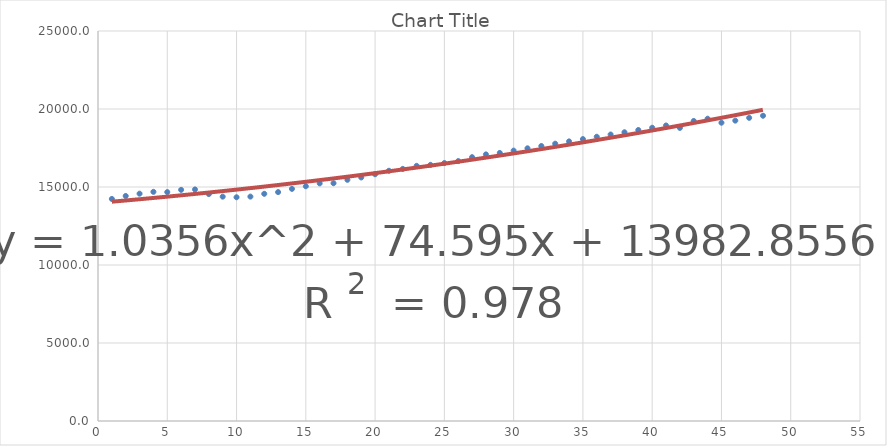
| Category | Series 0 |
|---|---|
| 1.0 | 14235 |
| 2.0 | 14424.5 |
| 3.0 | 14571.9 |
| 4.0 | 14690 |
| 5.0 | 14672.9 |
| 6.0 | 14817.1 |
| 7.0 | 14844.3 |
| 8.0 | 14546.7 |
| 9.0 | 14381.2 |
| 10.0 | 14342.1 |
| 11.0 | 14384.4 |
| 12.0 | 14564.1 |
| 13.0 | 14672.5 |
| 14.0 | 14879.2 |
| 15.0 | 15049.8 |
| 16.0 | 15231.7 |
| 17.0 | 15242.9 |
| 18.0 | 15461.9 |
| 19.0 | 15611.8 |
| 20.0 | 15818.7 |
| 21.0 | 16041.6 |
| 22.0 | 16160.4 |
| 23.0 | 16356 |
| 24.0 | 16420.3 |
| 25.0 | 16535.3 |
| 26.0 | 16661 |
| 27.0 | 16912.9 |
| 28.0 | 17089.6 |
| 29.0 | 17183.811 |
| 30.0 | 17331.778 |
| 31.0 | 17479.744 |
| 32.0 | 17627.711 |
| 33.0 | 17775.678 |
| 34.0 | 17923.644 |
| 35.0 | 18071.611 |
| 36.0 | 18219.578 |
| 37.0 | 18364.287 |
| 38.0 | 18508.995 |
| 39.0 | 18653.704 |
| 40.0 | 18798.413 |
| 41.0 | 18943.122 |
| 42.0 | 18787.83 |
| 43.0 | 19232.539 |
| 44.0 | 19377.248 |
| 45.0 | 19121.957 |
| 46.0 | 19255 |
| 47.0 | 19433.8 |
| 48.0 | 19567.9 |